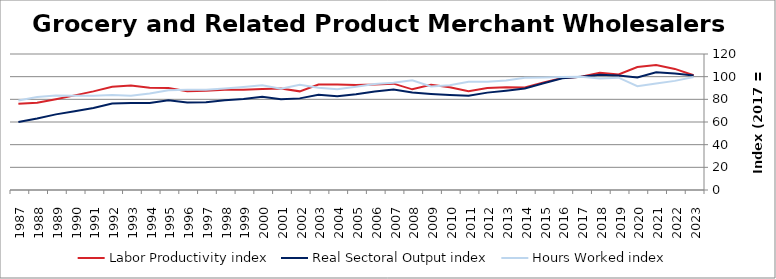
| Category | Labor Productivity index | Real Sectoral Output index | Hours Worked index |
|---|---|---|---|
| 2023.0 | 101.232 | 100.928 | 99.7 |
| 2022.0 | 106.829 | 102.857 | 96.282 |
| 2021.0 | 110.36 | 103.793 | 94.049 |
| 2020.0 | 108.546 | 99.351 | 91.529 |
| 2019.0 | 101.945 | 101.051 | 99.124 |
| 2018.0 | 103.376 | 101.643 | 98.323 |
| 2017.0 | 100 | 100 | 100 |
| 2016.0 | 98.918 | 98.538 | 99.616 |
| 2015.0 | 94.773 | 94.165 | 99.359 |
| 2014.0 | 90.427 | 89.565 | 99.047 |
| 2013.0 | 90.629 | 87.635 | 96.696 |
| 2012.0 | 89.917 | 85.919 | 95.553 |
| 2011.0 | 87.126 | 83.229 | 95.526 |
| 2010.0 | 90.697 | 83.866 | 92.468 |
| 2009.0 | 92.781 | 84.79 | 91.387 |
| 2008.0 | 88.821 | 85.965 | 96.785 |
| 2007.0 | 93.833 | 88.771 | 94.605 |
| 2006.0 | 92.996 | 86.988 | 93.539 |
| 2005.0 | 92.71 | 84.55 | 91.198 |
| 2004.0 | 93.112 | 82.73 | 88.85 |
| 2003.0 | 93.115 | 84.059 | 90.274 |
| 2002.0 | 87.046 | 80.844 | 92.875 |
| 2001.0 | 89.59 | 80.001 | 89.297 |
| 2000.0 | 89.203 | 82.358 | 92.327 |
| 1999.0 | 88.469 | 80.36 | 90.834 |
| 1998.0 | 88.472 | 79.214 | 89.536 |
| 1997.0 | 87.519 | 77.371 | 88.405 |
| 1996.0 | 87.189 | 77.113 | 88.443 |
| 1995.0 | 90.001 | 79.274 | 88.081 |
| 1994.0 | 90.127 | 76.832 | 85.248 |
| 1993.0 | 92.141 | 76.671 | 83.21 |
| 1992.0 | 91.065 | 76.273 | 83.757 |
| 1991.0 | 87.019 | 72.445 | 83.252 |
| 1990.0 | 83.475 | 69.463 | 83.214 |
| 1989.0 | 80.129 | 66.731 | 83.279 |
| 1988.0 | 77.005 | 63.145 | 82.001 |
| 1987.0 | 76.016 | 60.09 | 79.049 |